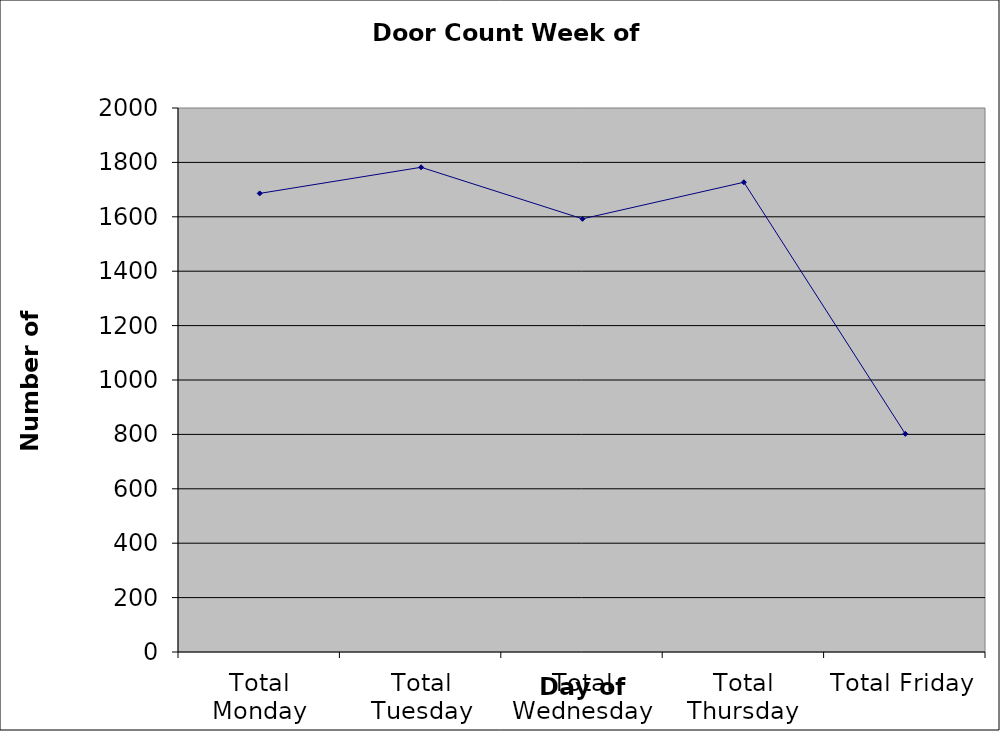
| Category | Series 0 |
|---|---|
| Total Monday | 1686 |
| Total Tuesday | 1782 |
| Total Wednesday | 1592.5 |
| Total Thursday | 1727 |
| Total Friday | 802 |